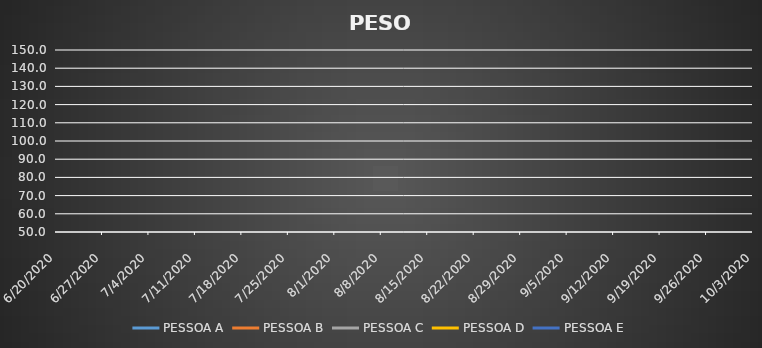
| Category | PESSOA A | PESSOA B | PESSOA C | PESSOA D | PESSOA E |
|---|---|---|---|---|---|
| 6/20/20 | 0 | 0 | 0 | 0 | 0 |
| 6/27/20 | 0 | 0 | 0 | 0 | 0 |
| 7/4/20 | 0 | 0 | 0 | 0 | 0 |
| 7/11/20 | 0 | 0 | 0 | 0 | 0 |
| 7/18/20 | 0 | 0 | 0 | 0 | 0 |
| 7/25/20 | 0 | 0 | 0 | 0 | 0 |
| 8/1/20 | 0 | 0 | 0 | 0 | 0 |
| 8/8/20 | 0 | 0 | 0 | 0 | 0 |
| 8/15/20 | 0 | 0 | 0 | 0 | 0 |
| 8/22/20 | 0 | 0 | 0 | 0 | 0 |
| 8/29/20 | 0 | 0 | 0 | 0 | 0 |
| 9/5/20 | 0 | 0 | 0 | 0 | 0 |
| 9/12/20 | 0 | 0 | 0 | 0 | 0 |
| 9/19/20 | 0 | 0 | 0 | 0 | 0 |
| 9/26/20 | 0 | 0 | 0 | 0 | 0 |
| 10/3/20 | 0 | 0 | 0 | 0 | 0 |